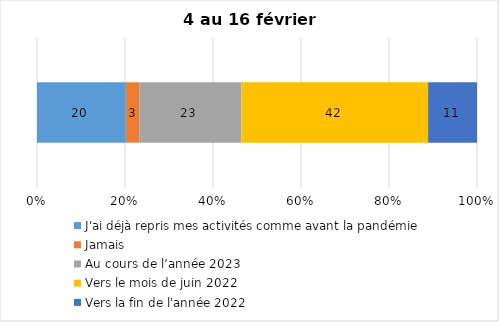
| Category | J'ai déjà repris mes activités comme avant la pandémie | Jamais | Au cours de l’année 2023 | Vers le mois de juin 2022 | Vers la fin de l'année 2022 |
|---|---|---|---|---|---|
| 0 | 20 | 3 | 23 | 42 | 11 |